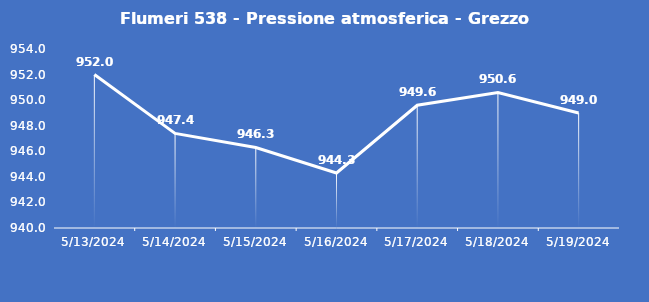
| Category | Flumeri 538 - Pressione atmosferica - Grezzo (hPa) |
|---|---|
| 5/13/24 | 952 |
| 5/14/24 | 947.4 |
| 5/15/24 | 946.3 |
| 5/16/24 | 944.3 |
| 5/17/24 | 949.6 |
| 5/18/24 | 950.6 |
| 5/19/24 | 949 |